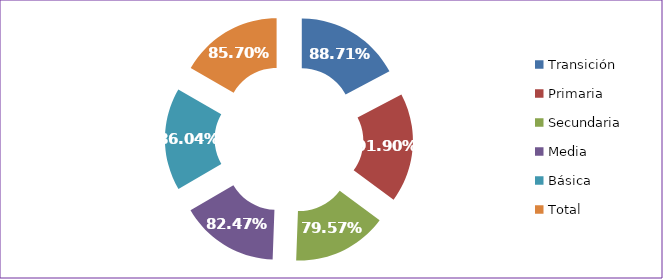
| Category | Tasa Aprobación |
|---|---|
| Transición | 0.887 |
| Primaria | 0.919 |
| Secundaria | 0.796 |
| Media | 0.825 |
| Básica | 0.86 |
| Total | 0.857 |